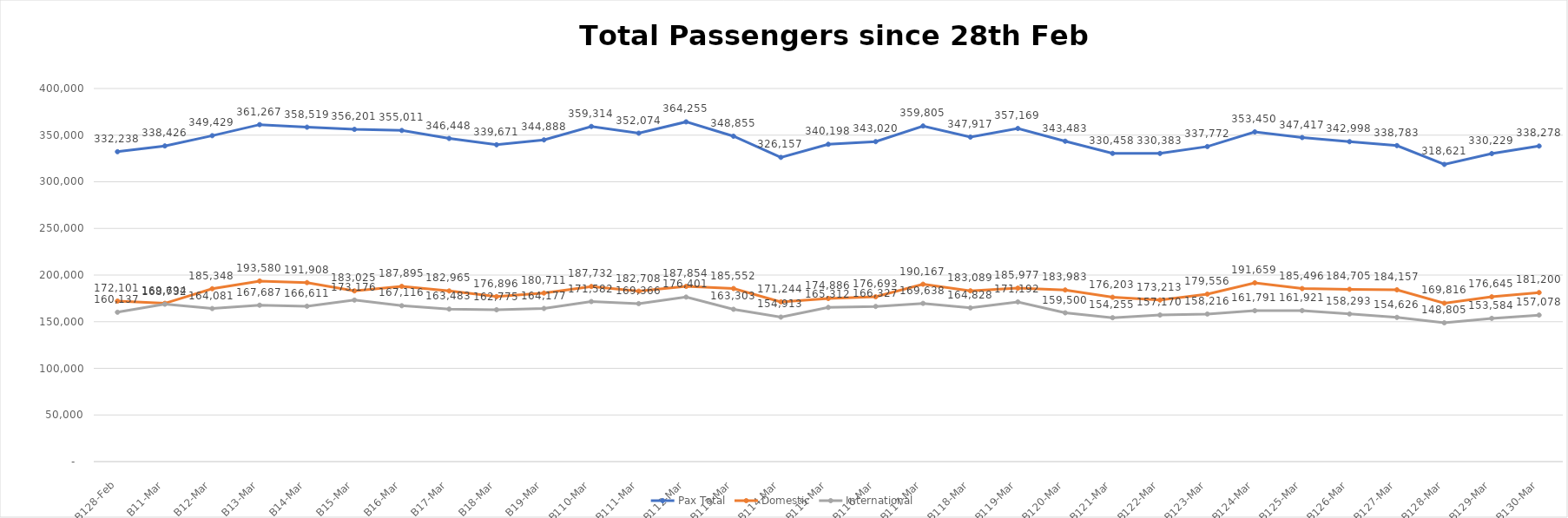
| Category | Pax Total |  Domestic  |  International  |
|---|---|---|---|
| 2023-02-28 | 332238 | 172101 | 160137 |
| 2023-03-01 | 338426 | 169694 | 168732 |
| 2023-03-02 | 349429 | 185348 | 164081 |
| 2023-03-03 | 361267 | 193580 | 167687 |
| 2023-03-04 | 358519 | 191908 | 166611 |
| 2023-03-05 | 356201 | 183025 | 173176 |
| 2023-03-06 | 355011 | 187895 | 167116 |
| 2023-03-07 | 346448 | 182965 | 163483 |
| 2023-03-08 | 339671 | 176896 | 162775 |
| 2023-03-09 | 344888 | 180711 | 164177 |
| 2023-03-10 | 359314 | 187732 | 171582 |
| 2023-03-11 | 352074 | 182708 | 169366 |
| 2023-03-12 | 364255 | 187854 | 176401 |
| 2023-03-13 | 348855 | 185552 | 163303 |
| 2023-03-14 | 326157 | 171244 | 154913 |
| 2023-03-15 | 340198 | 174886 | 165312 |
| 2023-03-16 | 343020 | 176693 | 166327 |
| 2023-03-17 | 359805 | 190167 | 169638 |
| 2023-03-18 | 347917 | 183089 | 164828 |
| 2023-03-19 | 357169 | 185977 | 171192 |
| 2023-03-20 | 343483 | 183983 | 159500 |
| 2023-03-21 | 330458 | 176203 | 154255 |
| 2023-03-22 | 330383 | 173213 | 157170 |
| 2023-03-23 | 337772 | 179556 | 158216 |
| 2023-03-24 | 353450 | 191659 | 161791 |
| 2023-03-25 | 347417 | 185496 | 161921 |
| 2023-03-26 | 342998 | 184705 | 158293 |
| 2023-03-27 | 338783 | 184157 | 154626 |
| 2023-03-28 | 318621 | 169816 | 148805 |
| 2023-03-29 | 330229 | 176645 | 153584 |
| 2023-03-30 | 338278 | 181200 | 157078 |